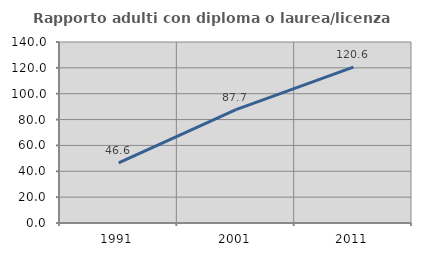
| Category | Rapporto adulti con diploma o laurea/licenza media  |
|---|---|
| 1991.0 | 46.575 |
| 2001.0 | 87.71 |
| 2011.0 | 120.556 |